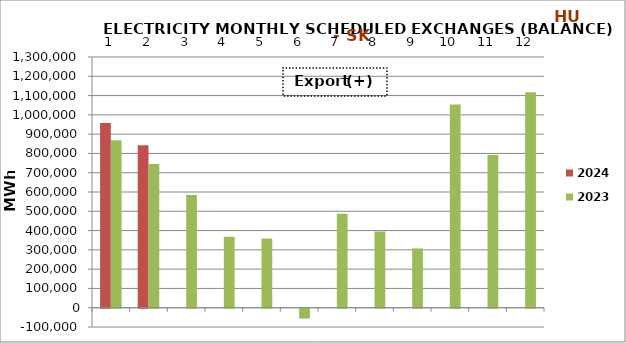
| Category | 2024 | 2023 |
|---|---|---|
| 0 | 957568.3 | 867906.05 |
| 1 | 843044.6 | 745628.775 |
| 2 | 0 | 584533.925 |
| 3 | 0 | 367608 |
| 4 | 0 | 358495.175 |
| 5 | 0 | -50962.2 |
| 6 | 0 | 487187.725 |
| 7 | 0 | 394976.725 |
| 8 | 0 | 307367.225 |
| 9 | 0 | 1053979.75 |
| 10 | 0 | 791291.8 |
| 11 | 0 | 1116586.8 |